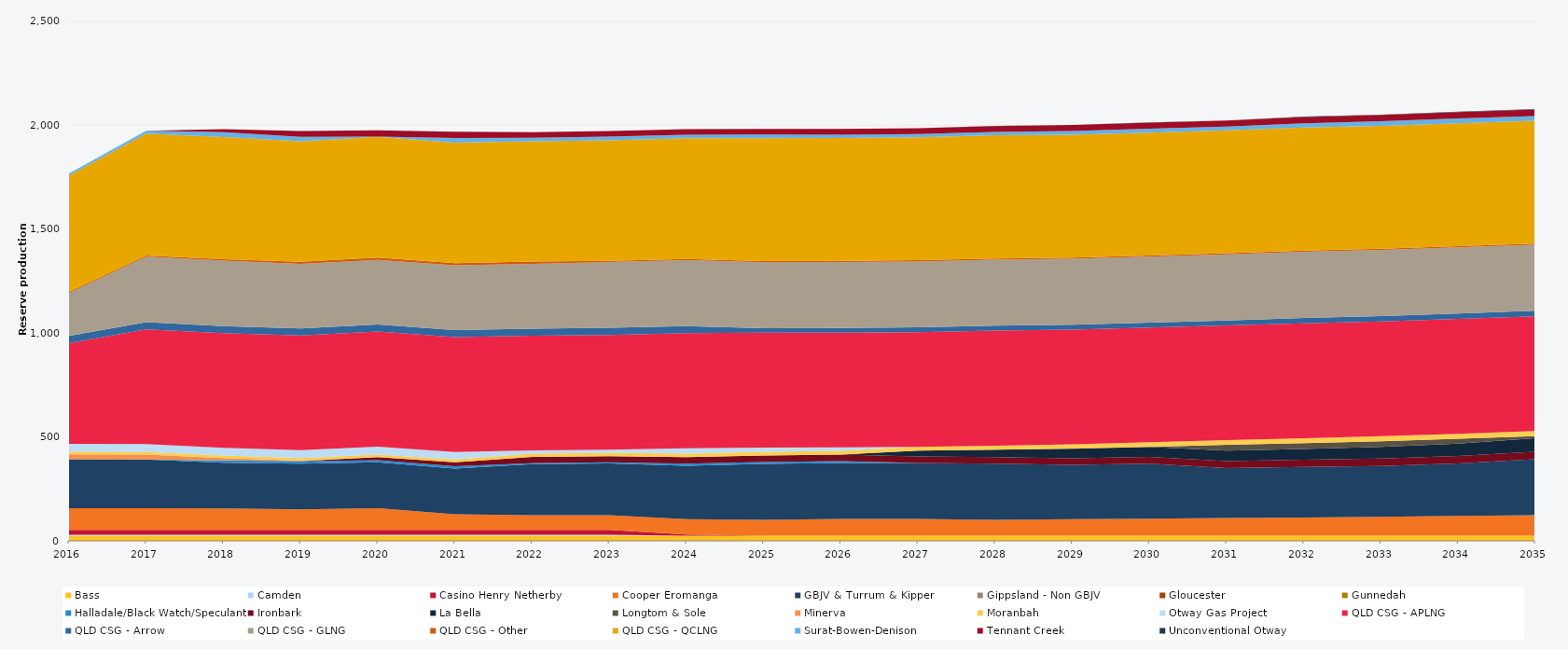
| Category | Bass | Camden | Casino Henry Netherby | Cooper Eromanga | GBJV & Turrum & Kipper | Gippsland - Non GBJV | Gloucester | Gunnedah | Halladale/Black Watch/Speculant | Ironbark | La Bella | Longtom & Sole | Minerva | Moranbah | Otway Gas Project | QLD CSG - APLNG | QLD CSG - Arrow | QLD CSG - GLNG | QLD CSG - Other | QLD CSG - QCLNG | Surat-Bowen-Denison | Tennant Creek | Unconventional Otway |
|---|---|---|---|---|---|---|---|---|---|---|---|---|---|---|---|---|---|---|---|---|---|---|---|
| 2016 | 24.522 | 5 | 23.12 | 105 | 235.041 | 0 | 0 | 0 | 0 | 0 | 0 | 0 | 23.79 | 12.859 | 38 | 484.594 | 34.038 | 206.697 | 5.856 | 559.876 | 9.617 | 0 | 0 |
| 2017 | 24.455 | 5 | 23.12 | 105 | 233.682 | 0 | 0 | 0 | 0 | 0 | 0 | 0 | 23.725 | 12.863 | 38 | 552.245 | 33.945 | 315.709 | 5.84 | 586.595 | 13.467 | 0 | 0 |
| 2018 | 24.455 | 5 | 23.12 | 103.781 | 220 | 0 | 0 | 0 | 10.254 | 0 | 0 | 0 | 11.236 | 13.029 | 36.497 | 552.245 | 33.945 | 315.639 | 5.84 | 588.867 | 22.79 | 14.512 | 0 |
| 2019 | 24.455 | 5 | 23.12 | 99.088 | 220 | 0 | 0 | 0 | 10.95 | 1.088 | 0 | 0 | 1.999 | 12.796 | 38 | 552.245 | 33.945 | 310.126 | 10.403 | 579.711 | 21.898 | 28.083 | 0 |
| 2020 | 24.522 | 5 | 23.12 | 105 | 220 | 0 | 0 | 0 | 10.95 | 14.318 | 0 | 0 | 0 | 12.768 | 37.92 | 553.758 | 34.038 | 310.96 | 10.419 | 581.442 | 1.043 | 30.881 | 0 |
| 2021 | 24.455 | 5 | 23.12 | 75.033 | 220 | 0 | 0 | 0 | 10.95 | 19.943 | 0 | 0 | 0 | 13.526 | 35.929 | 552.245 | 33.945 | 311.967 | 10.403 | 580.143 | 21.758 | 30.387 | 0 |
| 2022 | 24.455 | 5 | 23.12 | 71.044 | 245.44 | 0 | 0 | 0 | 5.059 | 30.17 | 0 | 0 | 0 | 15.305 | 15.814 | 552.245 | 33.945 | 311.905 | 10.403 | 579.646 | 16.345 | 27.517 | 0 |
| 2023 | 24.455 | 5 | 23.12 | 71.359 | 248.107 | 0 | 0 | 0 | 5.6 | 30.17 | 0 | 0 | 0 | 16.282 | 14.937 | 552.245 | 33.945 | 316.633 | 5.84 | 579.627 | 17.951 | 27.672 | 0 |
| 2024 | 24.522 | 0 | 5.3 | 74.572 | 256.838 | 0 | 0 | 0 | 10.141 | 31.066 | 0 | 0 | 0 | 16.806 | 26.42 | 553.758 | 34.038 | 317.367 | 5.856 | 580.633 | 17.159 | 27.367 | 0 |
| 2025 | 24.455 | 0 | 0 | 76.162 | 270 | 0 | 0 | 0 | 8.829 | 31.407 | 0 | 0 | 0 | 17.285 | 21.191 | 552.245 | 22.077 | 316.806 | 5.84 | 591.794 | 17.19 | 27.579 | 0 |
| 2026 | 24.455 | 0 | 0 | 80.499 | 270 | 0 | 0 | 0 | 9.267 | 31.209 | 0 | 0 | 0 | 17.534 | 16.9 | 552.245 | 22.876 | 316.704 | 5.84 | 591.753 | 15.255 | 27.77 | 0 |
| 2027 | 24.455 | 0 | 0 | 80.561 | 270 | 0 | 0 | 0 | 0 | 31.251 | 28 | 0 | 0 | 18.159 | 0 | 552.245 | 23.167 | 316.867 | 5.84 | 591.694 | 15.617 | 27.987 | 0.508 |
| 2028 | 24.522 | 0 | 0 | 76.561 | 270 | 0 | 0 | 0 | 0 | 31.585 | 36.25 | 0 | 0 | 19.008 | 0 | 553.758 | 23.513 | 317.838 | 5.856 | 593.235 | 15.87 | 28.197 | 0.929 |
| 2029 | 24.455 | 0 | 0 | 79.357 | 262.044 | 0 | 0 | 0 | 0 | 31.889 | 46.008 | 0.638 | 0 | 20.36 | 0 | 552.245 | 23.397 | 316.91 | 5.84 | 591.622 | 18.098 | 28.519 | 0.857 |
| 2030 | 24.455 | 0 | 0 | 82.324 | 264.56 | 0 | 0 | 0 | 0 | 33.138 | 47.511 | 0.73 | 0 | 21.622 | 0 | 552.245 | 23.644 | 317.293 | 5.84 | 591.579 | 19.011 | 28.91 | 1.342 |
| 2031 | 24.455 | 0 | 0 | 85.103 | 240.213 | 0 | 0 | 0 | 0 | 34.272 | 50.487 | 27.375 | 0 | 22.567 | 0 | 552.245 | 24.211 | 317.568 | 5.84 | 591.53 | 17.968 | 29.222 | 0.496 |
| 2032 | 24.522 | 0 | 0 | 87.956 | 242.999 | 0 | 0 | 0 | 0 | 35.168 | 51.71 | 27.45 | 0 | 23.484 | 0 | 553.758 | 25.31 | 318.7 | 5.856 | 593.07 | 19.93 | 30.12 | 2.034 |
| 2033 | 24.455 | 0 | 0 | 90.925 | 244.508 | 0 | 0 | 0 | 0 | 35.704 | 56.377 | 27.375 | 0 | 23.992 | 0 | 552.245 | 26.325 | 318.169 | 5.84 | 591.435 | 22.42 | 30.603 | 1.057 |
| 2034 | 24.455 | 0 | 0 | 95.625 | 252.337 | 0 | 0 | 0 | 0 | 35.88 | 59.766 | 22.915 | 0 | 24.563 | 0 | 552.245 | 26.511 | 318.356 | 5.84 | 591.394 | 23.195 | 30.906 | 1.702 |
| 2035 | 24.455 | 0 | 0 | 99.532 | 269.427 | 0 | 0 | 0 | 0 | 35.992 | 64.316 | 10.029 | 0 | 24.813 | 0 | 552.245 | 26.426 | 317.84 | 5.84 | 591.053 | 22.933 | 31.375 | 2.075 |